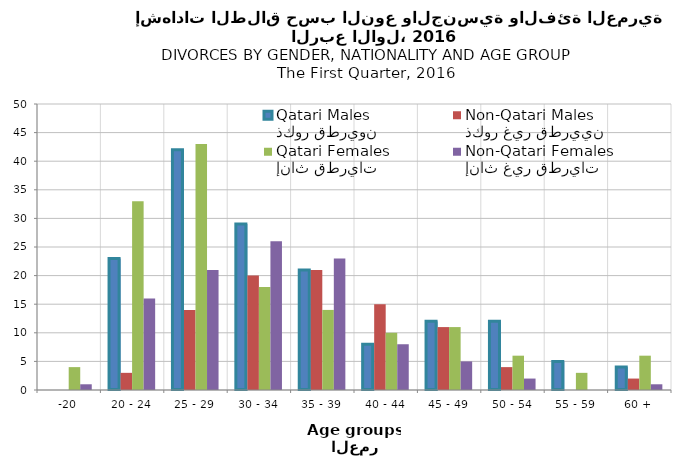
| Category | ذكور قطريون
Qatari Males | ذكور غير قطريين
Non-Qatari Males | إناث قطريات
Qatari Females | إناث غير قطريات
Non-Qatari Females |
|---|---|---|---|---|
| -20 | 0 | 0 | 4 | 1 |
| 20 - 24 | 23 | 3 | 33 | 16 |
| 25 - 29 | 42 | 14 | 43 | 21 |
| 30 - 34 | 29 | 20 | 18 | 26 |
| 35 - 39 | 21 | 21 | 14 | 23 |
| 40 - 44 | 8 | 15 | 10 | 8 |
| 45 - 49 | 12 | 11 | 11 | 5 |
| 50 - 54 | 12 | 4 | 6 | 2 |
| 55 - 59 | 5 | 0 | 3 | 0 |
| 60 + | 4 | 2 | 6 | 1 |